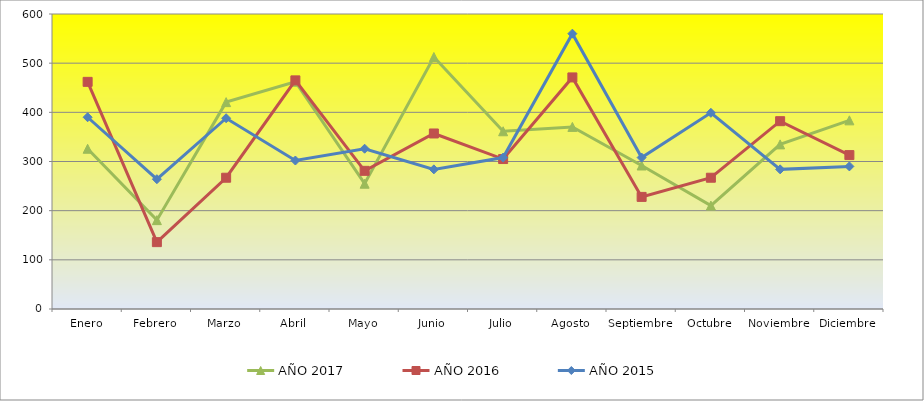
| Category | AÑO 2017 | AÑO 2016 | AÑO 2015 |
|---|---|---|---|
| Enero | 325.926 | 462 | 390 |
| Febrero | 180.741 | 136 | 264 |
| Marzo | 420.741 | 267 | 388 |
| Abril | 462.222 | 465 | 302 |
| Mayo | 254.815 | 281 | 326 |
| Junio | 512.593 | 357 | 284 |
| Julio | 361.481 | 305 | 308 |
| Agosto | 370.37 | 471 | 560 |
| Septiembre | 291.852 | 228 | 308 |
| Octubre | 210.37 | 267 | 399 |
| Noviembre | 334.815 | 382 | 284 |
| Diciembre | 383.704 | 313 | 290 |